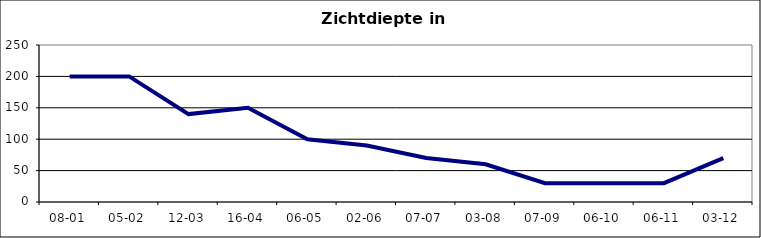
| Category | Zichtdiepte in cm |
|---|---|
| 08-01 | 200 |
| 05-02 | 200 |
| 12-03 | 140 |
| 16-04 | 150 |
| 06-05 | 100 |
| 02-06 | 90 |
| 07-07 | 70 |
| 03-08 | 60 |
| 07-09 | 30 |
| 06-10 | 30 |
| 06-11 | 30 |
| 03-12 | 70 |